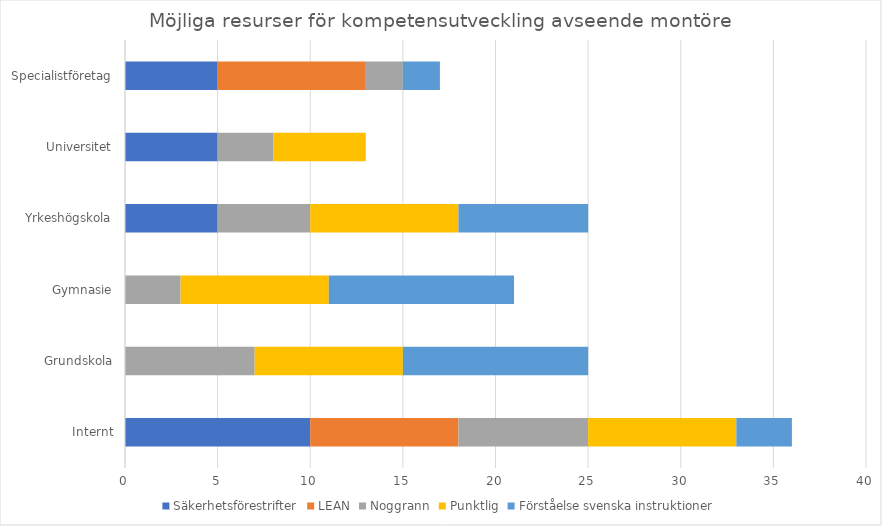
| Category | Säkerhetsförestrifter | LEAN | Noggrann | Punktlig | Förståelse svenska instruktioner |
|---|---|---|---|---|---|
| Internt | 10 | 8 | 7 | 8 | 3 |
| Grundskola | 0 | 0 | 7 | 8 | 10 |
| Gymnasie | 0 | 0 | 3 | 8 | 10 |
| Yrkeshögskola | 5 | 0 | 5 | 8 | 7 |
| Universitet | 5 | 0 | 3 | 5 | 0 |
| Specialistföretag | 5 | 8 | 2 | 0 | 2 |